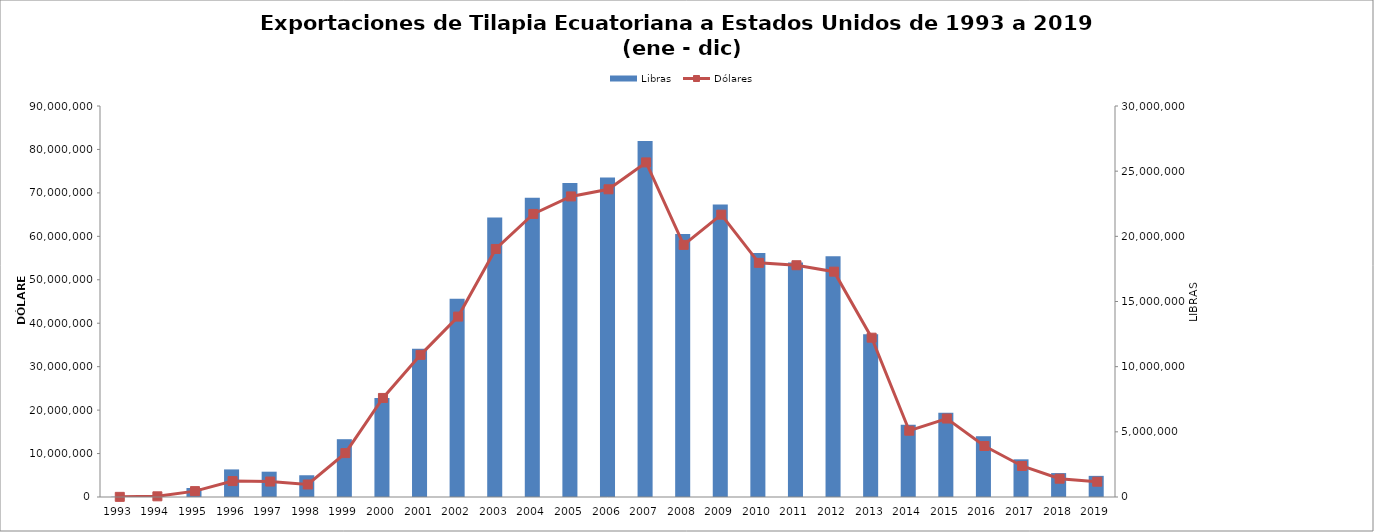
| Category | Libras |
|---|---|
| 1993.0 | 21730.742 |
| 1994.0 | 88499.258 |
| 1995.0 | 689457.786 |
| 1996.0 | 2116647.483 |
| 1997.0 | 1941708.064 |
| 1998.0 | 1668547.101 |
| 1999.0 | 4434656.516 |
| 2000.0 | 7599686.097 |
| 2001.0 | 11373890.75 |
| 2002.0 | 15219326.029 |
| 2003.0 | 21443302.043 |
| 2004.0 | 22953708.776 |
| 2005.0 | 24101028.913 |
| 2006.0 | 24512713.712 |
| 2007.0 | 27315395.237 |
| 2008.0 | 20170218.295 |
| 2009.0 | 22438586.35 |
| 2010.0 | 18724421.773 |
| 2011.0 | 17995543.535 |
| 2012.0 | 18477544.051 |
| 2013.0 | 12494087.693 |
| 2014.0 | 5552509.969 |
| 2015.0 | 6465454.516 |
| 2016.0 | 4663040.341 |
| 2017.0 | 2890376.104 |
| 2018.0 | 1835184.029 |
| 2019.0 | 1621389.754 |